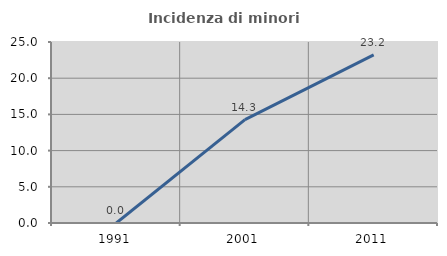
| Category | Incidenza di minori stranieri |
|---|---|
| 1991.0 | 0 |
| 2001.0 | 14.286 |
| 2011.0 | 23.214 |